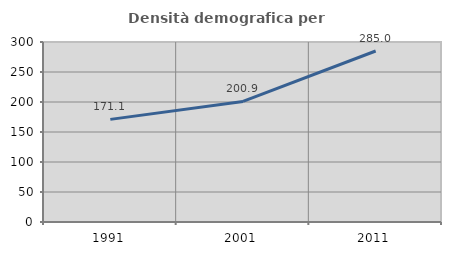
| Category | Densità demografica |
|---|---|
| 1991.0 | 171.063 |
| 2001.0 | 200.907 |
| 2011.0 | 285.002 |